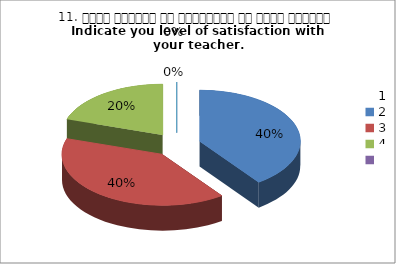
| Category | 11. अपने शिक्षक से संतुष्टि का स्तर बताइये
Indicate you level of satisfaction with your teacher.
 |
|---|---|
| 0 | 2 |
| 1 | 2 |
| 2 | 1 |
| 3 | 0 |
| 4 | 0 |